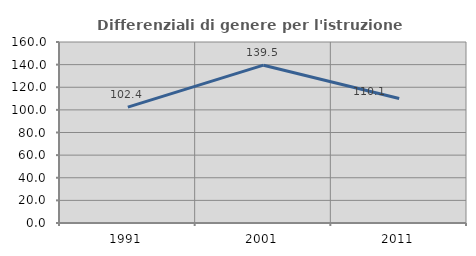
| Category | Differenziali di genere per l'istruzione superiore |
|---|---|
| 1991.0 | 102.412 |
| 2001.0 | 139.51 |
| 2011.0 | 110.121 |